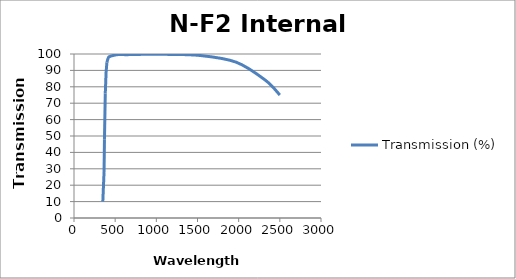
| Category | Transmission (%) |
|---|---|
| 350.0 | 10 |
| 365.0 | 28 |
| 370.0 | 48 |
| 380.0 | 76 |
| 390.0 | 89 |
| 400.0 | 95 |
| 405.0 | 95.9 |
| 420.0 | 98 |
| 436.0 | 98.5 |
| 460.0 | 98.9 |
| 500.0 | 99.4 |
| 546.0 | 99.7 |
| 580.0 | 99.7 |
| 620.0 | 99.6 |
| 660.0 | 99.6 |
| 700.0 | 99.7 |
| 1060.0 | 99.8 |
| 1530.0 | 99.1 |
| 1970.0 | 95 |
| 2325.0 | 84 |
| 2500.0 | 75 |